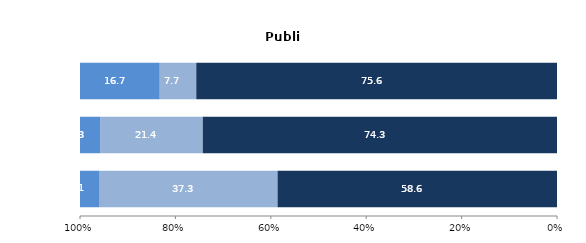
| Category | État (1) | Collectivités territoriales | Autres (2) |
|---|---|---|---|
| Établissements du premier degré | 58.627 | 37.28 | 4.094 |
| Établissements du second degré (3) | 74.323 | 21.419 | 4.258 |
| Établissements du supérieur | 75.647 | 7.651 | 16.702 |